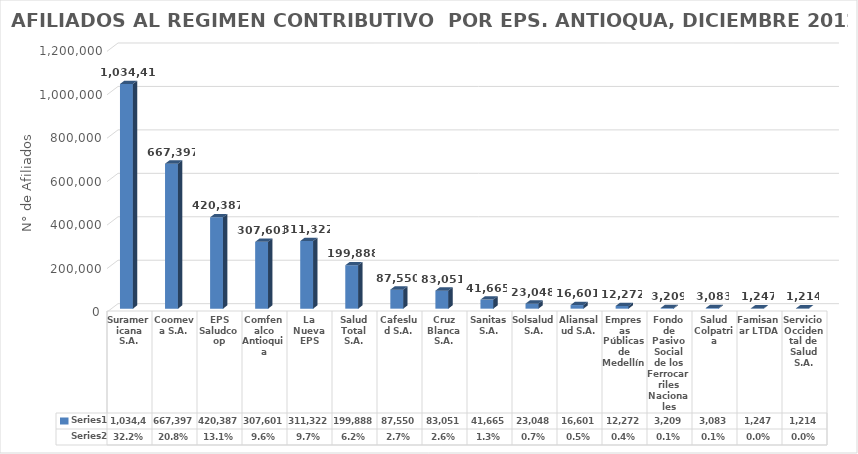
| Category | Series 0 | Series 1 |
|---|---|---|
| Suramericana S.A. | 1034415 | 0.322 |
| Coomeva S.A. | 667397 | 0.208 |
| EPS Saludcoop | 420387 | 0.131 |
| Comfenalco Antioquia | 307601 | 0.096 |
| La Nueva EPS | 311322 | 0.097 |
| Salud Total S.A. | 199888 | 0.062 |
| Cafeslud S.A. | 87550 | 0.027 |
| Cruz Blanca S.A. | 83051 | 0.026 |
| Sanitas S.A. | 41665 | 0.013 |
| Solsalud S.A. | 23048 | 0.007 |
| Aliansalud S.A. | 16601 | 0.005 |
| Empresas Públicas de Medellín | 12272 | 0.004 |
| Fondo de Pasivo Social de los Ferrocarriles Nacionales | 3209 | 0.001 |
| Salud Colpatria | 3083 | 0.001 |
| Famisanar LTDA | 1247 | 0 |
| Servicio Occidental de Salud S.A. | 1214 | 0 |